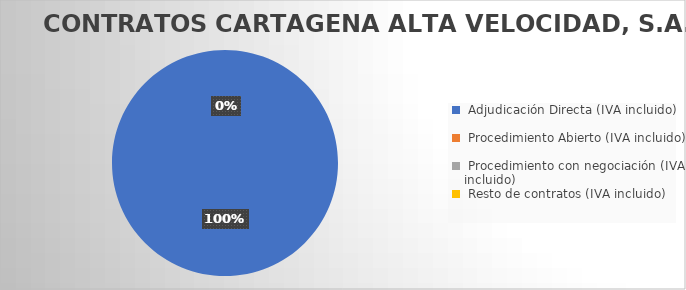
| Category | Series 0 |
|---|---|
|  Adjudicación Directa (IVA incluido)  | 34742.827 |
|  Procedimiento Abierto (IVA incluido)  | 0 |
|  Procedimiento con negociación (IVA incluido)  | 0 |
|  Resto de contratos (IVA incluido)  | 0 |